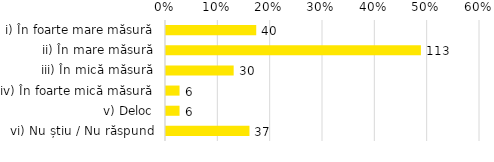
| Category | Total |
|---|---|
| i) În foarte mare măsură | 0.172 |
| ii) În mare măsură | 0.487 |
| iii) În mică măsură | 0.129 |
| iv) În foarte mică măsură | 0.026 |
| v) Deloc | 0.026 |
| vi) Nu știu / Nu răspund | 0.159 |